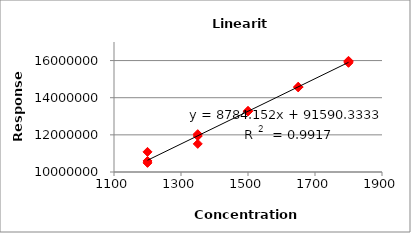
| Category | Series 0 |
|---|---|
| 1200.0 | 10489898 |
| 1200.0 | 10594228 |
| 1200.0 | 11083871 |
| 1350.0 | 11513839 |
| 1350.0 | 11937356 |
| 1350.0 | 12037028 |
| 1500.0 | 13275901 |
| 1500.0 | 13264077 |
| 1500.0 | 13285496 |
| 1650.0 | 14567078 |
| 1650.0 | 14592609 |
| 1650.0 | 14558574 |
| 1800.0 | 15949989 |
| 1800.0 | 15988084 |
| 1800.0 | 15879247 |